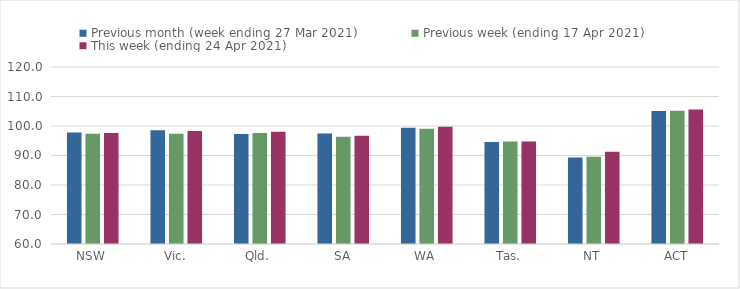
| Category | Previous month (week ending 27 Mar 2021) | Previous week (ending 17 Apr 2021) | This week (ending 24 Apr 2021) |
|---|---|---|---|
| NSW | 97.79 | 97.38 | 97.66 |
| Vic. | 98.52 | 97.39 | 98.32 |
| Qld. | 97.3 | 97.6 | 98.06 |
| SA | 97.47 | 96.38 | 96.68 |
| WA | 99.37 | 99.1 | 99.74 |
| Tas. | 94.56 | 94.76 | 94.76 |
| NT | 89.35 | 89.6 | 91.26 |
| ACT | 105.07 | 105.19 | 105.61 |